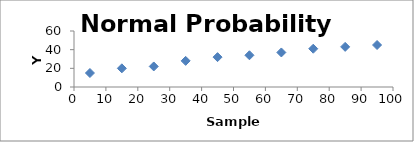
| Category | Series 0 |
|---|---|
| 5.0 | 15 |
| 15.0 | 20 |
| 25.0 | 22 |
| 35.0 | 28 |
| 45.0 | 32 |
| 55.0 | 34 |
| 65.0 | 37 |
| 75.0 | 41 |
| 85.0 | 43 |
| 95.0 | 45 |